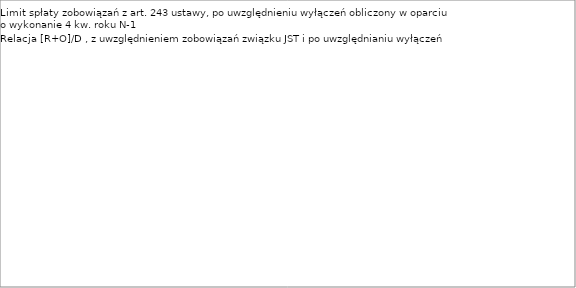
| Category | Limit spłaty zobowiązań z art. 243 ustawy, po uwzględnieniu wyłączeń obliczony w oparciu o wykonanie 4 kw. roku N-1 | Relacja [R+O]/D , z uwzględnieniem zobowiązań związku JST i po uwzględnianiu wyłączeń |
|---|---|---|
| 2014.0 | 0.177 | 0.058 |
| 2015.0 | 0.207 | 0 |
| 2016.0 | 0.172 | 0 |
| 2017.0 | 0.188 | 0 |